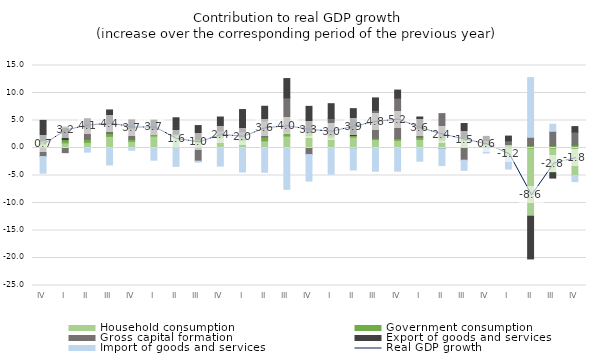
| Category | Household consumption | Government consumption | Gross capital formation | Export of goods and services | Import of goods and services |
|---|---|---|---|---|---|
| IV | 0.668 | 0.624 | -1.559 | 3.728 | -3.021 |
| I | 0.932 | 0.583 | -0.847 | 2.327 | 0.02 |
| II | 1.025 | 0.541 | 2.144 | 1.612 | -0.756 |
| III | 2.118 | 0.508 | 2.106 | 2.185 | -3.083 |
| IV | 1.221 | 0.367 | 1.988 | 1.548 | -0.407 |
| I | 2.165 | 0.335 | 0.902 | 1.669 | -2.216 |
| II | 2.177 | 0.328 | 0.051 | 2.939 | -3.347 |
| III | 1.107 | 0.396 | -2.388 | 2.577 | -0.188 |
| IV | 2.001 | 0.578 | 0.552 | 2.501 | -3.284 |
| I | 1.359 | 0.629 | 0.974 | 4.028 | -4.364 |
| II | 1.29 | 0.703 | 2.953 | 2.643 | -4.417 |
| III | 2.178 | 0.67 | 6.269 | 3.507 | -7.511 |
| IV | 2.273 | 0.522 | -1.19 | 4.775 | -4.831 |
| I | 1.88 | 0.409 | 3.087 | 2.68 | -4.757 |
| II | 1.977 | 0.296 | -0.112 | 4.882 | -3.887 |
| III | 1.536 | 0.258 | 5.054 | 2.261 | -4.216 |
| IV | 1.396 | 0.311 | 7.358 | 1.469 | -4.216 |
| I | 1.562 | 0.387 | 1.617 | 2.072 | -2.398 |
| II | 1.453 | 0.464 | 4.331 | -0.116 | -3.076 |
| III | 1.368 | 0.501 | -2.215 | 2.58 | -1.835 |
| IV | 0.595 | 0.488 | 0.282 | 0.749 | -0.913 |
| I | -1.632 | 0.474 | 0.835 | 0.856 | -2.195 |
| II | -12.405 | 0.428 | 1.524 | -7.761 | 10.851 |
| III | -4.498 | 0.419 | 2.616 | -0.968 | 1.284 |
| IV | -4.976 | 0.534 | 2.365 | 0.99 | -1.139 |